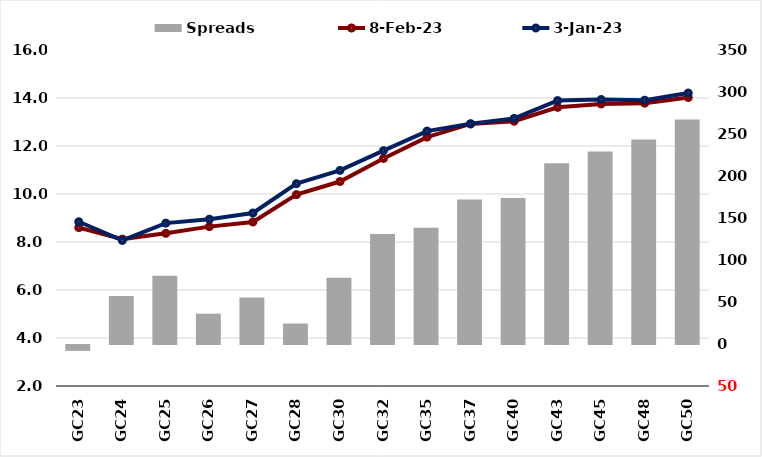
| Category |  Spreads   |
|---|---|
| GC23 | -7.056 |
| GC24 | 57.061 |
| GC25 | 81.19 |
| GC26 | 36.098 |
| GC27 | 55.462 |
| GC28 | 24.384 |
| GC30 | 78.991 |
| GC32 | 131.083 |
| GC35 | 138.482 |
| GC37 | 171.924 |
| GC40 | 173.879 |
| GC43 | 215.097 |
| GC45 | 229.154 |
| GC48 | 243.529 |
| GC50 | 267.246 |